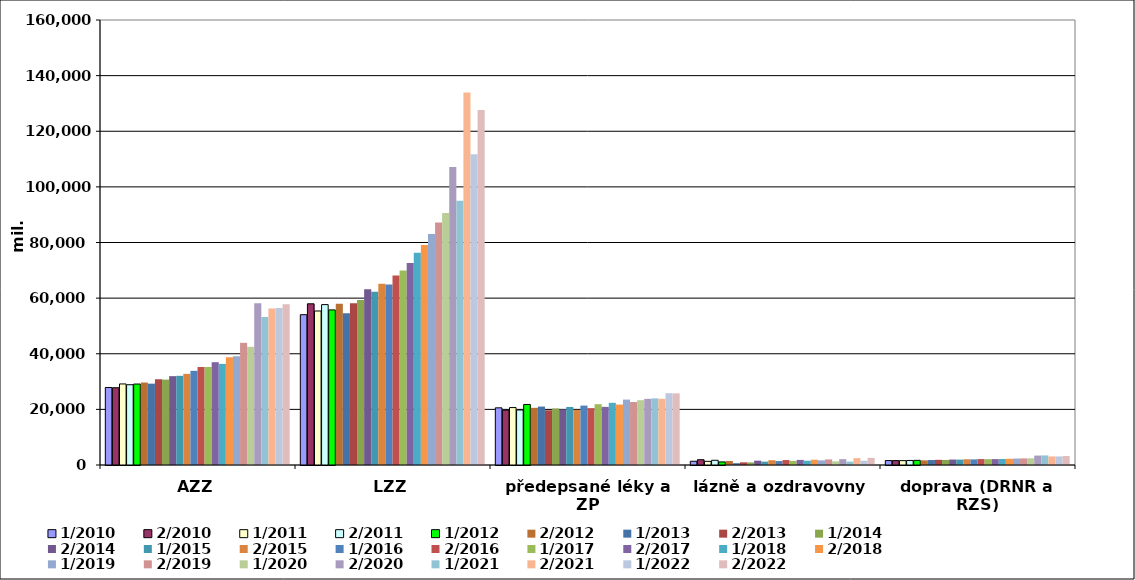
| Category | 1/2010 | 2/2010 | 1/2011 | 2/2011 | 1/2012 | 2/2012 | 1/2013 | 2/2013 | 1/2014 | 2/2014 | 1/2015 | 2/2015 | 1/2016 | 2/2016 | 1/2017 | 2/2017 | 1/2018 | 2/2018 | 1/2019 | 2/2019 | 1/2020 | 2/2020 | 1/2021 | 2/2021 | 1/2022 | 2/2022 |
|---|---|---|---|---|---|---|---|---|---|---|---|---|---|---|---|---|---|---|---|---|---|---|---|---|---|---|
| AZZ | 27871500 | 27777562 | 29145340 | 28864765 | 29109635 | 29651099 | 29249640 | 30809329 | 30709007 | 31944930 | 32067009 | 32764587 | 33857058 | 35241812 | 35248304 | 36968369 | 36350988.078 | 38737960.255 | 39099176.87 | 43928761.962 | 42487537.271 | 58114154.729 | 53220696.892 | 56224943.538 | 56425482.32 | 57817375.711 |
| LZZ | 54044390 | 57958096 | 55374535 | 57666178 | 55767166 | 57998535 | 54559665 | 58182293 | 59314076 | 63235089 | 62309242 | 65142346 | 64932393 | 68097001 | 69913591 | 72596147 | 76294005.393 | 79102106.582 | 83046630.732 | 87179315.032 | 90594189.398 | 107163907.602 | 95055236.001 | 133941459.878 | 111694276.26 | 127683530.384 |
| předepsané léky a ZP | 20553087 | 19728582 | 20648463 | 19781687 | 21765700 | 20556526 | 21010942 | 19680838 | 20322326 | 19974566 | 20868586 | 19820450 | 21362604 | 20442441 | 21868443 | 20902917 | 22360984.206 | 21730926.086 | 23521480.06 | 22643274.093 | 23299016.68 | 23788379.61 | 23946028.037 | 23780032.806 | 25813508.01 | 25753931.881 |
| lázně a ozdravovny | 1352659 | 1893781 | 1319971 | 1693140 | 1105386 | 1440711 | 648759 | 951245 | 919196 | 1554375 | 1199102 | 1712099 | 1418872 | 1784933 | 1479220 | 1838547 | 1534186.157 | 1884893.323 | 1657464.87 | 2017866.071 | 1298315.126 | 2093206.874 | 1219858.379 | 2464119.772 | 1534948.49 | 2560602.374 |
| doprava (DRNR a RZS) | 1591386 | 1584300 | 1569905 | 1629638 | 1678403 | 1677205 | 1783196 | 1862407 | 1821653 | 1953149 | 1937407 | 2073171 | 2017531 | 2127124 | 2100480 | 2118001 | 2156335.217 | 2231840.153 | 2316793.816 | 2362255.387 | 2405389.34 | 3384144.66 | 3443417.818 | 3065112.12 | 3069370.42 | 3217780.692 |